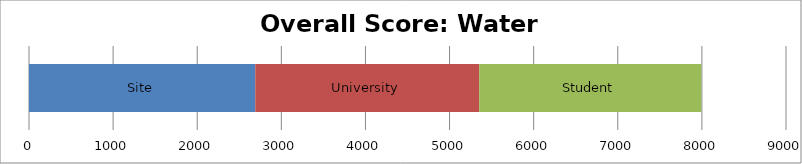
| Category | Site | University | Student |
|---|---|---|---|
| 0 | 2690 | 2662.5 | 2641.25 |